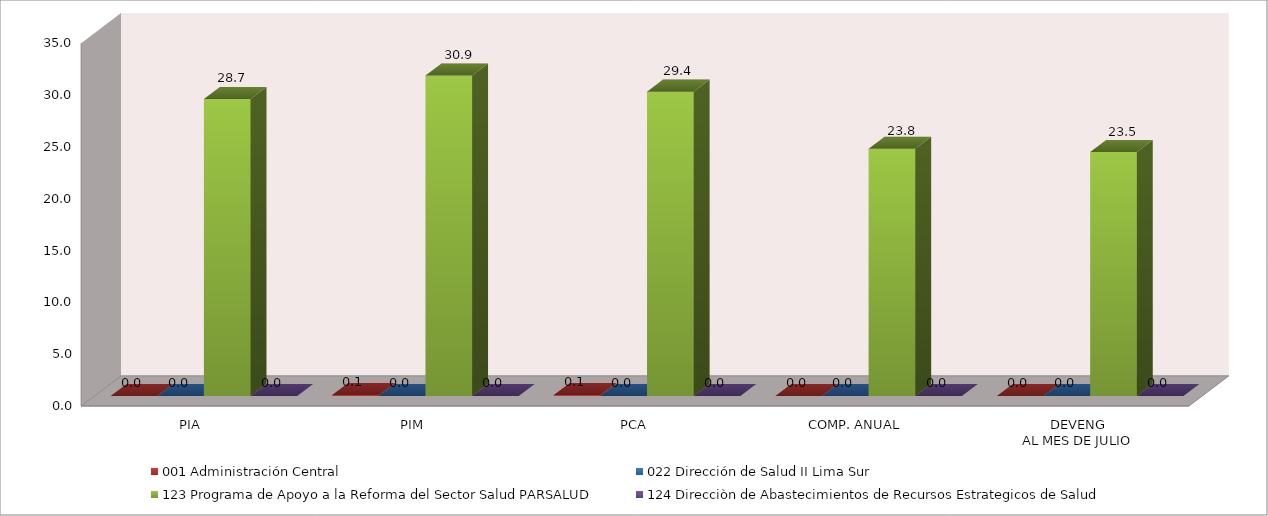
| Category | 001 Administración Central | 022 Dirección de Salud II Lima Sur | 123 Programa de Apoyo a la Reforma del Sector Salud PARSALUD | 124 Direcciòn de Abastecimientos de Recursos Estrategicos de Salud |
|---|---|---|---|---|
| PIA | 0 | 0 | 28.656 | 0 |
| PIM | 0.095 | 0 | 30.911 | 0 |
| PCA | 0.09 | 0 | 29.365 | 0 |
| COMP. ANUAL | 0 | 0 | 23.844 | 0 |
| DEVENG
AL MES DE JULIO | 0 | 0 | 23.536 | 0 |